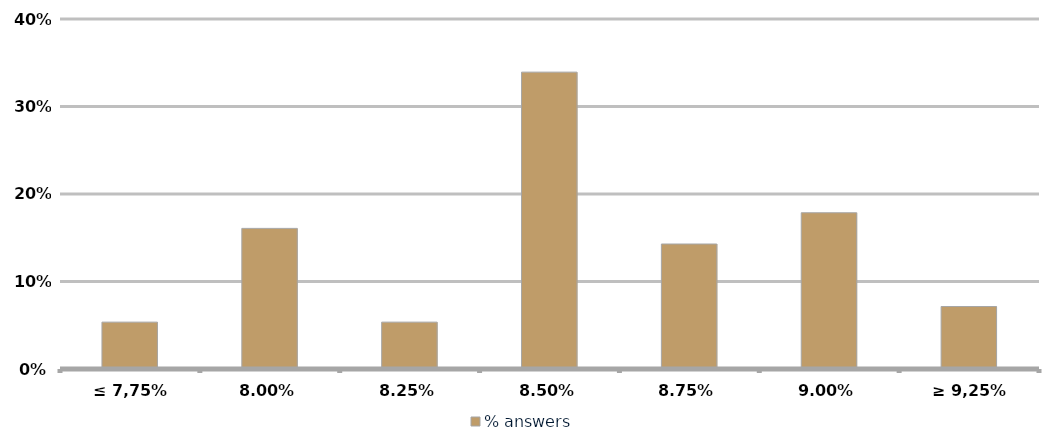
| Category | % answers |
|---|---|
| ≤ 7,75% | 0.054 |
| 8,00% | 0.161 |
| 8,25% | 0.054 |
| 8,50% | 0.339 |
| 8,75% | 0.143 |
| 9,00% | 0.179 |
| ≥ 9,25% | 0.071 |